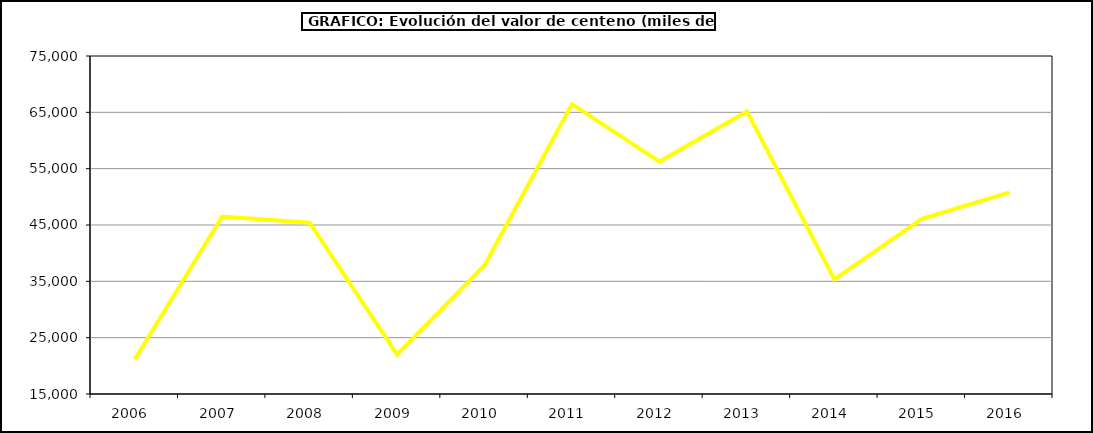
| Category | Valor |
|---|---|
| 2006.0 | 21119.616 |
| 2007.0 | 46497.545 |
| 2008.0 | 45398.884 |
| 2009.0 | 22005.119 |
| 2010.0 | 37852.67 |
| 2011.0 | 66477.888 |
| 2012.0 | 56263.16 |
| 2013.0 | 65145.46 |
| 2014.0 | 35358 |
| 2015.0 | 46088 |
| 2016.0 | 50792 |